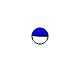
| Category | Series 0 |
|---|---|
| 0 | 10389 |
| 1 | 9891 |